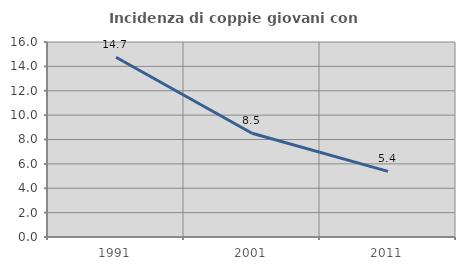
| Category | Incidenza di coppie giovani con figli |
|---|---|
| 1991.0 | 14.749 |
| 2001.0 | 8.516 |
| 2011.0 | 5.383 |